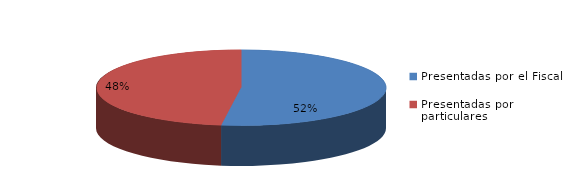
| Category | Series 0 |
|---|---|
| Presentadas por el Fiscal | 638 |
| Presentadas por particulares | 585 |